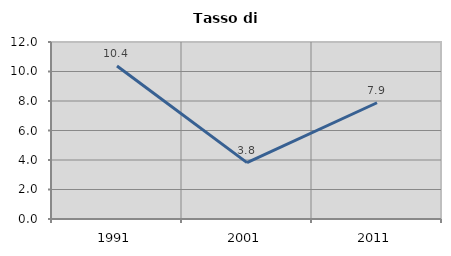
| Category | Tasso di disoccupazione   |
|---|---|
| 1991.0 | 10.372 |
| 2001.0 | 3.825 |
| 2011.0 | 7.881 |